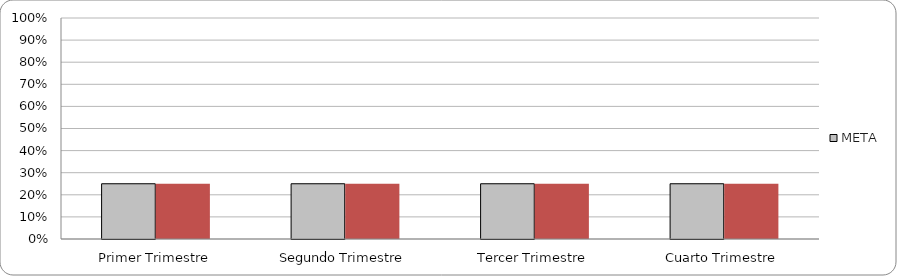
| Category | META | 25% |
|---|---|---|
| Primer Trimestre | 0.25 | 0.25 |
| Segundo Trimestre | 0.25 | 0.25 |
| Tercer Trimestre | 0.25 | 0.25 |
| Cuarto Trimestre | 0.25 | 0.25 |